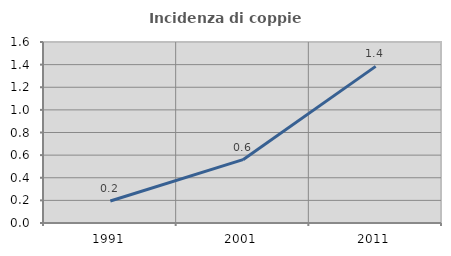
| Category | Incidenza di coppie miste |
|---|---|
| 1991.0 | 0.194 |
| 2001.0 | 0.56 |
| 2011.0 | 1.385 |